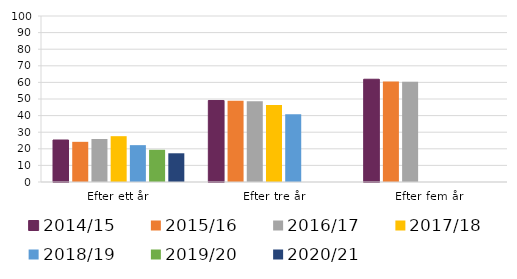
| Category | 2014/15 | 2015/16 | 2016/17 | 2017/18 | 2018/19 | 2019/20 | 2020/21 |
|---|---|---|---|---|---|---|---|
| Efter ett år | 25.3 | 24.2 | 25.9 | 27.6 | 22.2 | 19.4 | 17.3 |
| Efter tre år | 49.1 | 49 | 48.6 | 46.4 | 40.8 | 0 | 0 |
| Efter fem år | 61.9 | 60.6 | 60.4 | 0 | 0 | 0 | 0 |